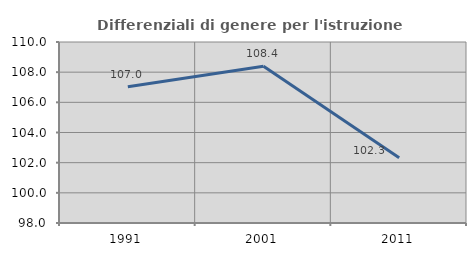
| Category | Differenziali di genere per l'istruzione superiore |
|---|---|
| 1991.0 | 107.03 |
| 2001.0 | 108.399 |
| 2011.0 | 102.325 |